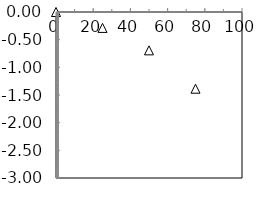
| Category | Series 2 |
|---|---|
| 0.0 | 0 |
| 25.0 | -0.288 |
| 50.0 | -0.693 |
| 75.0 | -1.386 |